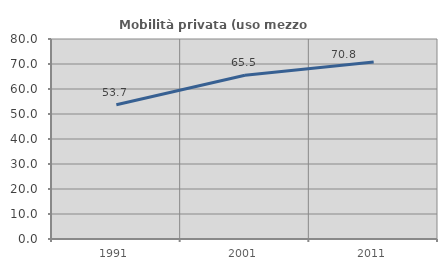
| Category | Mobilità privata (uso mezzo privato) |
|---|---|
| 1991.0 | 53.676 |
| 2001.0 | 65.526 |
| 2011.0 | 70.823 |